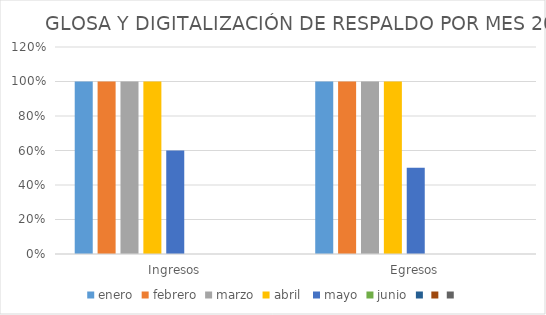
| Category | enero | febrero | marzo | abril  | mayo | junio | Series 6 | Series 7 | Series 8 |
|---|---|---|---|---|---|---|---|---|---|
| Ingresos | 1 | 1 | 1 | 1 | 0.6 |  |  |  |  |
| Egresos | 1 | 1 | 1 | 1 | 0.5 |  |  |  |  |